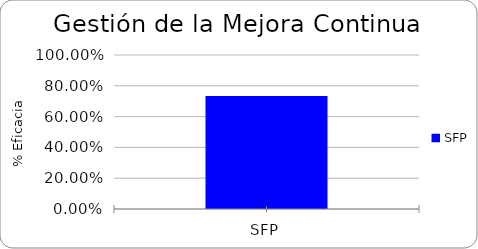
| Category | % Eficacia total |
|---|---|
| SFP | 0.733 |